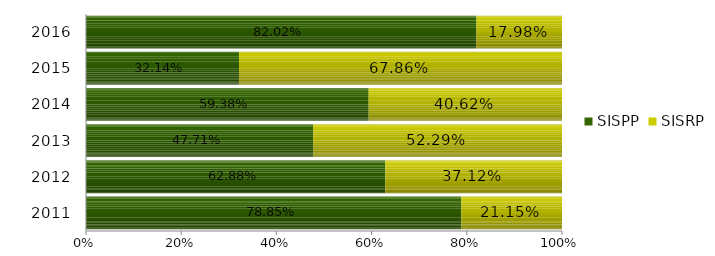
| Category | SISPP | SISRP |
|---|---|---|
| 2011.0 | 0.789 | 0.211 |
| 2012.0 | 0.629 | 0.371 |
| 2013.0 | 0.477 | 0.523 |
| 2014.0 | 0.594 | 0.406 |
| 2015.0 | 0.321 | 0.679 |
| 2016.0 | 0.82 | 0.18 |